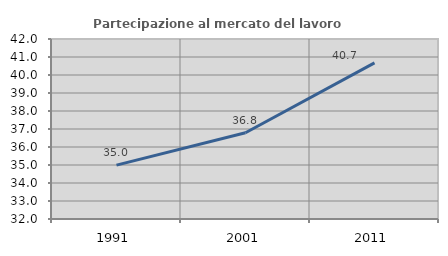
| Category | Partecipazione al mercato del lavoro  femminile |
|---|---|
| 1991.0 | 34.993 |
| 2001.0 | 36.794 |
| 2011.0 | 40.67 |